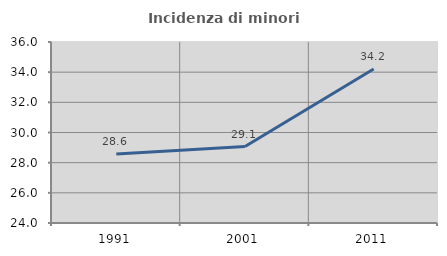
| Category | Incidenza di minori stranieri |
|---|---|
| 1991.0 | 28.571 |
| 2001.0 | 29.07 |
| 2011.0 | 34.211 |